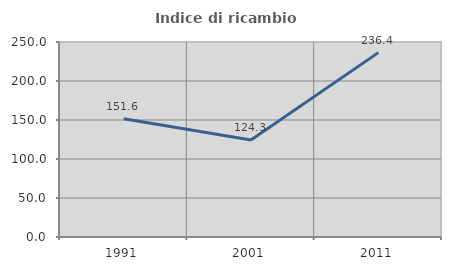
| Category | Indice di ricambio occupazionale  |
|---|---|
| 1991.0 | 151.613 |
| 2001.0 | 124.324 |
| 2011.0 | 236.364 |